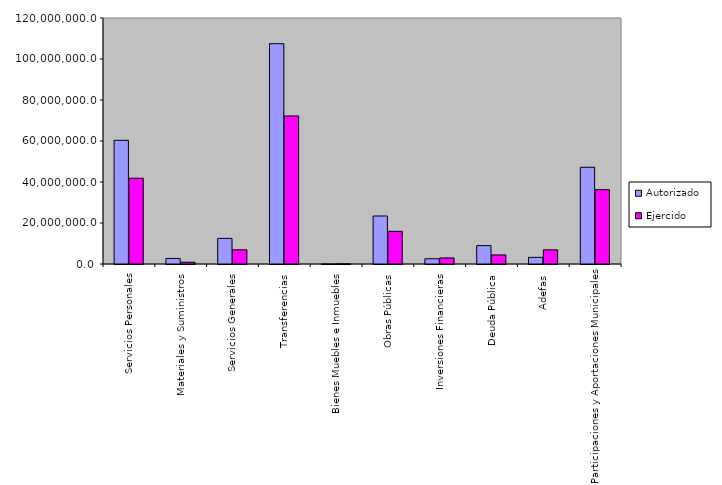
| Category | Autorizado | Ejercido |
|---|---|---|
| 0 | 60341463.1 | 41830659.7 |
| 1 | 2710247.7 | 849582 |
| 2 | 12499675.9 | 6930201.8 |
| 3 | 107454281.3 | 72225513.1 |
| 4 | 4331.4 | 78699.1 |
| 5 | 23420419.6 | 15940122.1 |
| 6 | 2560133.5 | 2953213.5 |
| 7 | 8965665.2 | 4417879.9 |
| 8 | 3243691 | 6898611.8 |
| 9 | 47198300.6 | 36249462 |